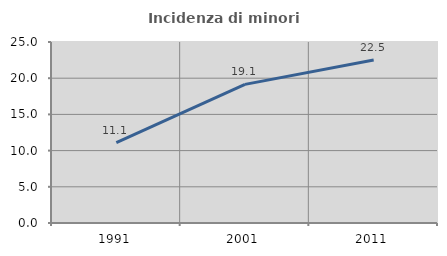
| Category | Incidenza di minori stranieri |
|---|---|
| 1991.0 | 11.111 |
| 2001.0 | 19.149 |
| 2011.0 | 22.523 |